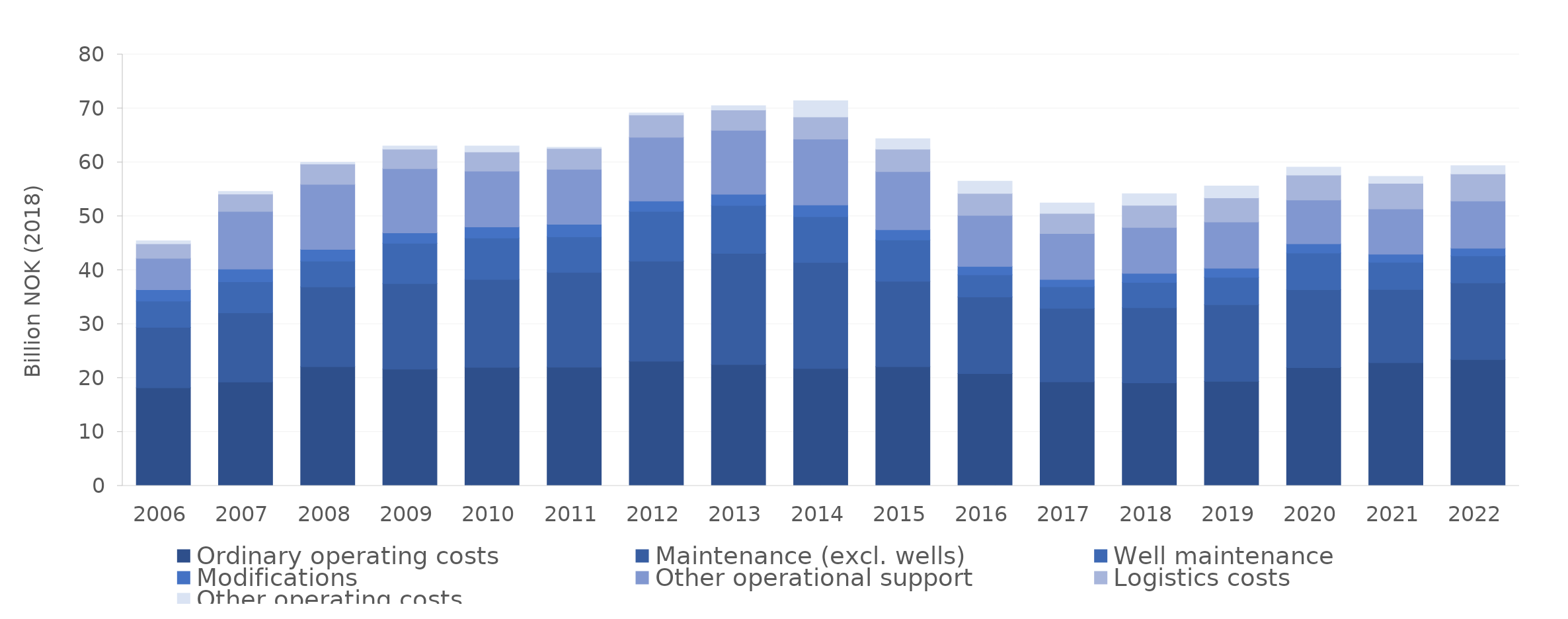
| Category | Ordinary operating costs | Maintenance (excl. wells) | Well maintenance | Modifications  | Other operational support  | Logistics costs | Other operating costs |
|---|---|---|---|---|---|---|---|
| 2006.0 | 18.196 | 11.215 | 4.851 | 2.126 | 5.823 | 2.695 | 0.558 |
| 2007.0 | 19.267 | 12.846 | 5.756 | 2.344 | 10.689 | 3.222 | 0.476 |
| 2008.0 | 22.111 | 14.803 | 4.758 | 2.183 | 12.073 | 3.767 | 0.321 |
| 2009.0 | 21.653 | 15.855 | 7.488 | 1.927 | 11.899 | 3.616 | 0.598 |
| 2010.0 | 21.981 | 16.289 | 7.687 | 2.075 | 10.333 | 3.573 | 1.103 |
| 2011.0 | 22.017 | 17.598 | 6.58 | 2.323 | 10.203 | 3.859 | 0.193 |
| 2012.0 | 23.137 | 18.534 | 9.232 | 1.924 | 11.818 | 4.148 | 0.375 |
| 2013.0 | 22.507 | 20.628 | 8.859 | 2.081 | 11.851 | 3.783 | 0.803 |
| 2014.0 | 21.788 | 19.65 | 8.48 | 2.176 | 12.223 | 4.099 | 2.993 |
| 2015.0 | 22.103 | 15.845 | 7.654 | 1.907 | 10.788 | 4.149 | 1.942 |
| 2016.0 | 20.812 | 14.223 | 4.115 | 1.542 | 9.465 | 4.076 | 2.284 |
| 2017.0 | 19.3 | 13.635 | 3.992 | 1.359 | 8.52 | 3.734 | 1.915 |
| 2018.0 | 19.105 | 13.934 | 4.681 | 1.699 | 8.511 | 4.111 | 2.155 |
| 2019.0 | 19.377 | 14.21 | 5.105 | 1.679 | 8.569 | 4.474 | 2.19 |
| 2020.0 | 21.933 | 14.45 | 6.817 | 1.702 | 8.128 | 4.609 | 1.469 |
| 2021.0 | 22.862 | 13.555 | 5.049 | 1.5 | 8.387 | 4.744 | 1.306 |
| 2022.0 | 23.434 | 14.217 | 5.012 | 1.419 | 8.761 | 5.012 | 1.527 |